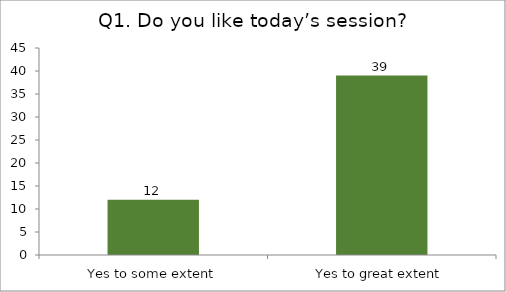
| Category | Q1. Do you like today’s session? |
|---|---|
| Yes to some extent | 12 |
| Yes to great extent | 39 |